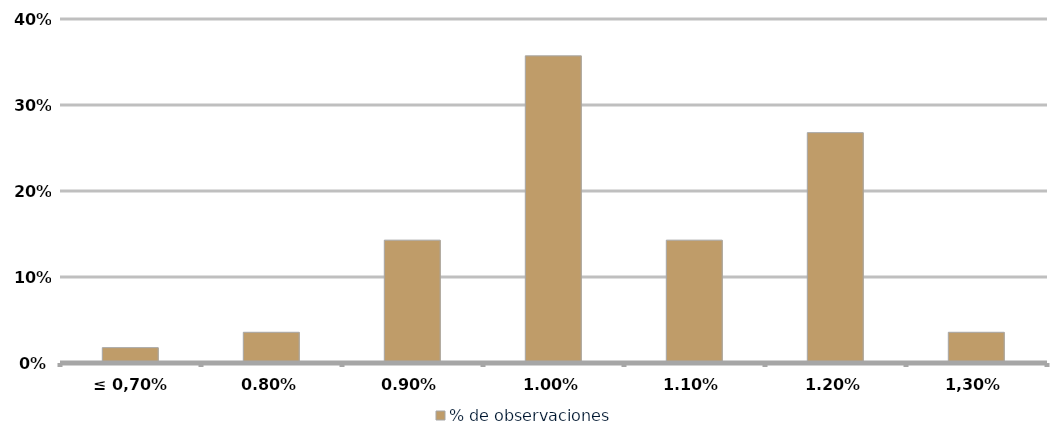
| Category | % de observaciones  |
|---|---|
| ≤ 0,70% | 0.018 |
| 0,80% | 0.036 |
| 0,90% | 0.143 |
| 1,00% | 0.357 |
| 1,10% | 0.143 |
| 1,20% | 0.268 |
| 1,30% | 0.036 |